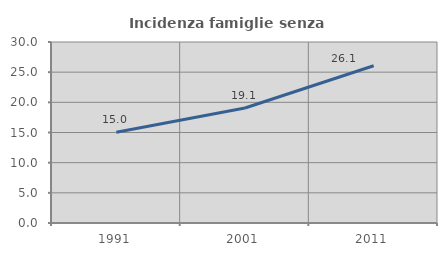
| Category | Incidenza famiglie senza nuclei |
|---|---|
| 1991.0 | 15.03 |
| 2001.0 | 19.063 |
| 2011.0 | 26.07 |